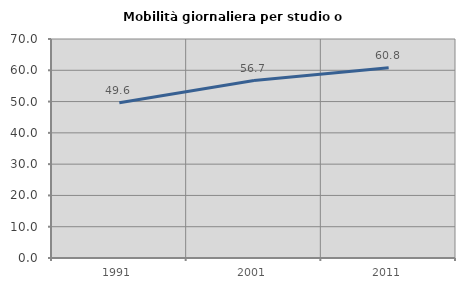
| Category | Mobilità giornaliera per studio o lavoro |
|---|---|
| 1991.0 | 49.611 |
| 2001.0 | 56.714 |
| 2011.0 | 60.825 |